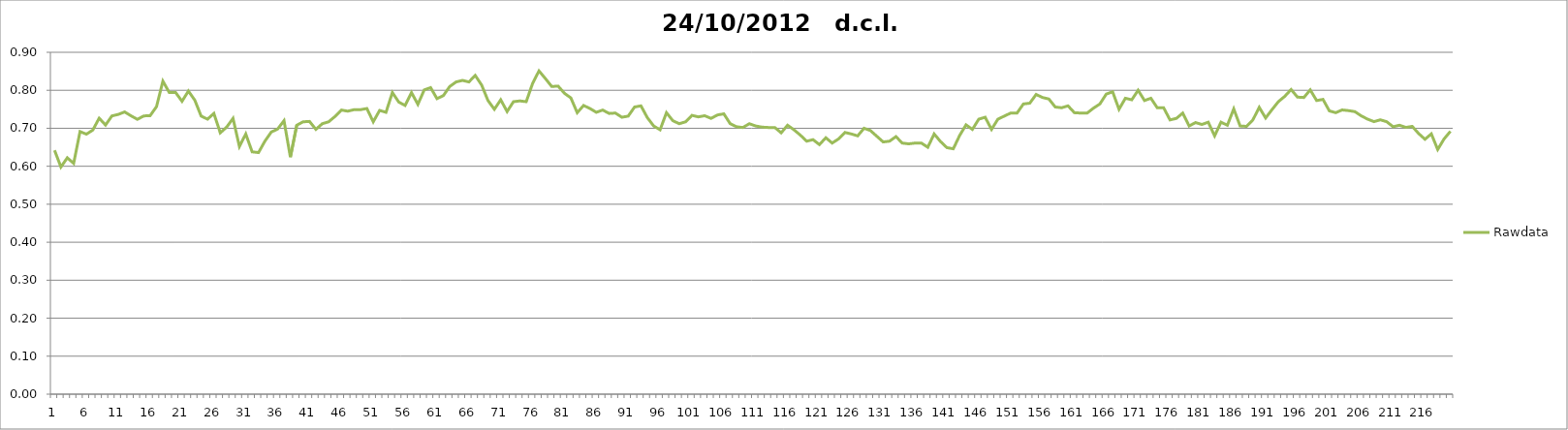
| Category | Rawdata |
|---|---|
| 0 | 0.642 |
| 1 | 0.598 |
| 2 | 0.622 |
| 3 | 0.608 |
| 4 | 0.691 |
| 5 | 0.685 |
| 6 | 0.695 |
| 7 | 0.727 |
| 8 | 0.709 |
| 9 | 0.733 |
| 10 | 0.736 |
| 11 | 0.743 |
| 12 | 0.733 |
| 13 | 0.724 |
| 14 | 0.733 |
| 15 | 0.733 |
| 16 | 0.757 |
| 17 | 0.824 |
| 18 | 0.794 |
| 19 | 0.794 |
| 20 | 0.771 |
| 21 | 0.798 |
| 22 | 0.774 |
| 23 | 0.732 |
| 24 | 0.724 |
| 25 | 0.739 |
| 26 | 0.688 |
| 27 | 0.703 |
| 28 | 0.726 |
| 29 | 0.652 |
| 30 | 0.685 |
| 31 | 0.638 |
| 32 | 0.636 |
| 33 | 0.666 |
| 34 | 0.69 |
| 35 | 0.698 |
| 36 | 0.72 |
| 37 | 0.624 |
| 38 | 0.708 |
| 39 | 0.717 |
| 40 | 0.718 |
| 41 | 0.697 |
| 42 | 0.712 |
| 43 | 0.717 |
| 44 | 0.731 |
| 45 | 0.748 |
| 46 | 0.745 |
| 47 | 0.749 |
| 48 | 0.749 |
| 49 | 0.752 |
| 50 | 0.717 |
| 51 | 0.747 |
| 52 | 0.742 |
| 53 | 0.794 |
| 54 | 0.769 |
| 55 | 0.76 |
| 56 | 0.794 |
| 57 | 0.763 |
| 58 | 0.801 |
| 59 | 0.807 |
| 60 | 0.778 |
| 61 | 0.786 |
| 62 | 0.81 |
| 63 | 0.822 |
| 64 | 0.826 |
| 65 | 0.822 |
| 66 | 0.839 |
| 67 | 0.814 |
| 68 | 0.773 |
| 69 | 0.75 |
| 70 | 0.775 |
| 71 | 0.744 |
| 72 | 0.77 |
| 73 | 0.772 |
| 74 | 0.77 |
| 75 | 0.818 |
| 76 | 0.851 |
| 77 | 0.831 |
| 78 | 0.81 |
| 79 | 0.811 |
| 80 | 0.792 |
| 81 | 0.78 |
| 82 | 0.741 |
| 83 | 0.76 |
| 84 | 0.752 |
| 85 | 0.742 |
| 86 | 0.748 |
| 87 | 0.739 |
| 88 | 0.74 |
| 89 | 0.729 |
| 90 | 0.732 |
| 91 | 0.756 |
| 92 | 0.759 |
| 93 | 0.728 |
| 94 | 0.706 |
| 95 | 0.696 |
| 96 | 0.741 |
| 97 | 0.72 |
| 98 | 0.712 |
| 99 | 0.717 |
| 100 | 0.734 |
| 101 | 0.73 |
| 102 | 0.733 |
| 103 | 0.726 |
| 104 | 0.735 |
| 105 | 0.738 |
| 106 | 0.712 |
| 107 | 0.704 |
| 108 | 0.702 |
| 109 | 0.712 |
| 110 | 0.706 |
| 111 | 0.703 |
| 112 | 0.702 |
| 113 | 0.702 |
| 114 | 0.688 |
| 115 | 0.708 |
| 116 | 0.696 |
| 117 | 0.682 |
| 118 | 0.666 |
| 119 | 0.67 |
| 120 | 0.657 |
| 121 | 0.675 |
| 122 | 0.661 |
| 123 | 0.672 |
| 124 | 0.689 |
| 125 | 0.685 |
| 126 | 0.68 |
| 127 | 0.7 |
| 128 | 0.694 |
| 129 | 0.679 |
| 130 | 0.664 |
| 131 | 0.666 |
| 132 | 0.678 |
| 133 | 0.661 |
| 134 | 0.659 |
| 135 | 0.661 |
| 136 | 0.661 |
| 137 | 0.65 |
| 138 | 0.685 |
| 139 | 0.665 |
| 140 | 0.649 |
| 141 | 0.646 |
| 142 | 0.681 |
| 143 | 0.709 |
| 144 | 0.697 |
| 145 | 0.724 |
| 146 | 0.729 |
| 147 | 0.697 |
| 148 | 0.724 |
| 149 | 0.732 |
| 150 | 0.74 |
| 151 | 0.74 |
| 152 | 0.764 |
| 153 | 0.766 |
| 154 | 0.789 |
| 155 | 0.781 |
| 156 | 0.777 |
| 157 | 0.756 |
| 158 | 0.754 |
| 159 | 0.759 |
| 160 | 0.741 |
| 161 | 0.74 |
| 162 | 0.74 |
| 163 | 0.753 |
| 164 | 0.764 |
| 165 | 0.79 |
| 166 | 0.796 |
| 167 | 0.75 |
| 168 | 0.779 |
| 169 | 0.775 |
| 170 | 0.8 |
| 171 | 0.773 |
| 172 | 0.779 |
| 173 | 0.754 |
| 174 | 0.754 |
| 175 | 0.722 |
| 176 | 0.726 |
| 177 | 0.74 |
| 178 | 0.706 |
| 179 | 0.715 |
| 180 | 0.71 |
| 181 | 0.716 |
| 182 | 0.68 |
| 183 | 0.716 |
| 184 | 0.708 |
| 185 | 0.751 |
| 186 | 0.706 |
| 187 | 0.705 |
| 188 | 0.722 |
| 189 | 0.755 |
| 190 | 0.727 |
| 191 | 0.749 |
| 192 | 0.77 |
| 193 | 0.784 |
| 194 | 0.802 |
| 195 | 0.782 |
| 196 | 0.781 |
| 197 | 0.801 |
| 198 | 0.773 |
| 199 | 0.776 |
| 200 | 0.746 |
| 201 | 0.741 |
| 202 | 0.748 |
| 203 | 0.746 |
| 204 | 0.744 |
| 205 | 0.733 |
| 206 | 0.724 |
| 207 | 0.718 |
| 208 | 0.722 |
| 209 | 0.717 |
| 210 | 0.704 |
| 211 | 0.708 |
| 212 | 0.702 |
| 213 | 0.705 |
| 214 | 0.686 |
| 215 | 0.671 |
| 216 | 0.685 |
| 217 | 0.644 |
| 218 | 0.672 |
| 219 | 0.692 |